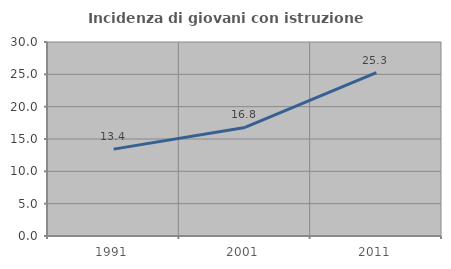
| Category | Incidenza di giovani con istruzione universitaria |
|---|---|
| 1991.0 | 13.437 |
| 2001.0 | 16.794 |
| 2011.0 | 25.268 |